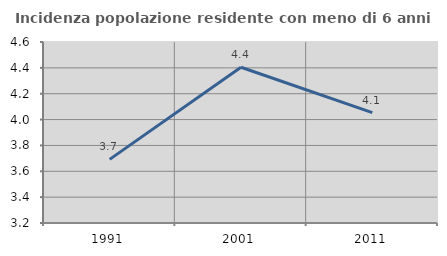
| Category | Incidenza popolazione residente con meno di 6 anni |
|---|---|
| 1991.0 | 3.692 |
| 2001.0 | 4.405 |
| 2011.0 | 4.054 |